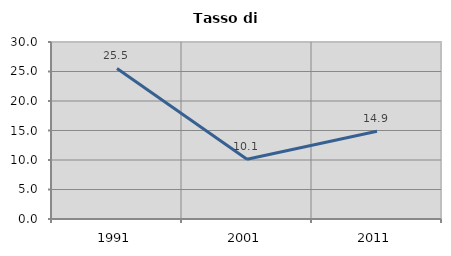
| Category | Tasso di disoccupazione   |
|---|---|
| 1991.0 | 25.51 |
| 2001.0 | 10.119 |
| 2011.0 | 14.865 |